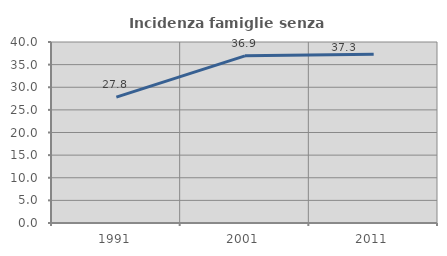
| Category | Incidenza famiglie senza nuclei |
|---|---|
| 1991.0 | 27.832 |
| 2001.0 | 36.944 |
| 2011.0 | 37.275 |